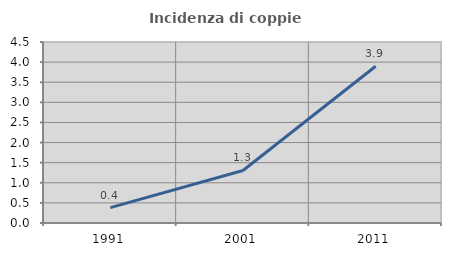
| Category | Incidenza di coppie miste |
|---|---|
| 1991.0 | 0.383 |
| 2001.0 | 1.306 |
| 2011.0 | 3.896 |